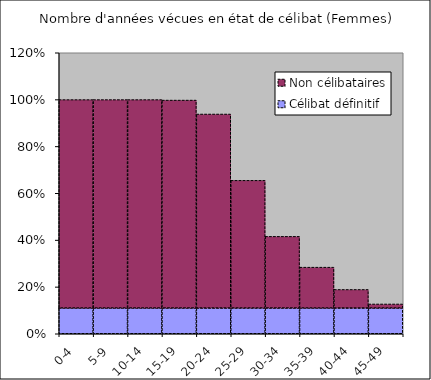
| Category | Célibat définitif | Non célibataires |
|---|---|---|
| 0-4 | 0.11 | 0.89 |
| 5-9 | 0.11 | 0.89 |
| 10-14 | 0.11 | 0.89 |
| 15-19 | 0.11 | 0.888 |
| 20-24 | 0.11 | 0.829 |
| 25-29 | 0.11 | 0.546 |
| 30-34 | 0.11 | 0.306 |
| 35-39 | 0.11 | 0.175 |
| 40-44 | 0.11 | 0.08 |
| 45-49 | 0.11 | 0.018 |